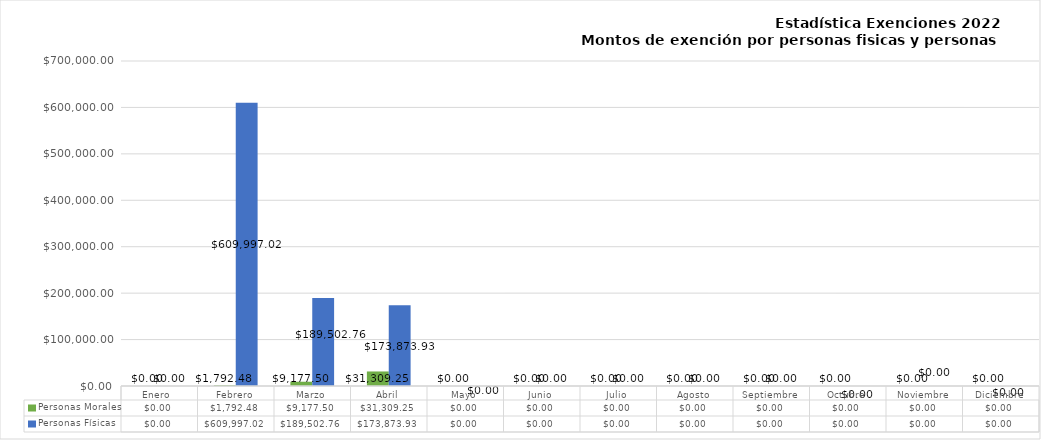
| Category | Personas Morales | Personas Físicas |
|---|---|---|
| Enero  | 0 | 0 |
| Febrero | 1792.48 | 609997.02 |
| Marzo | 9177.5 | 189502.76 |
| Abril | 31309.25 | 173873.93 |
| Mayo | 0 | 0 |
| Junio | 0 | 0 |
| Julio | 0 | 0 |
| Agosto | 0 | 0 |
| Septiembre | 0 | 0 |
| Octubre | 0 | 0 |
| Noviembre | 0 | 0 |
| Diciembre | 0 | 0 |